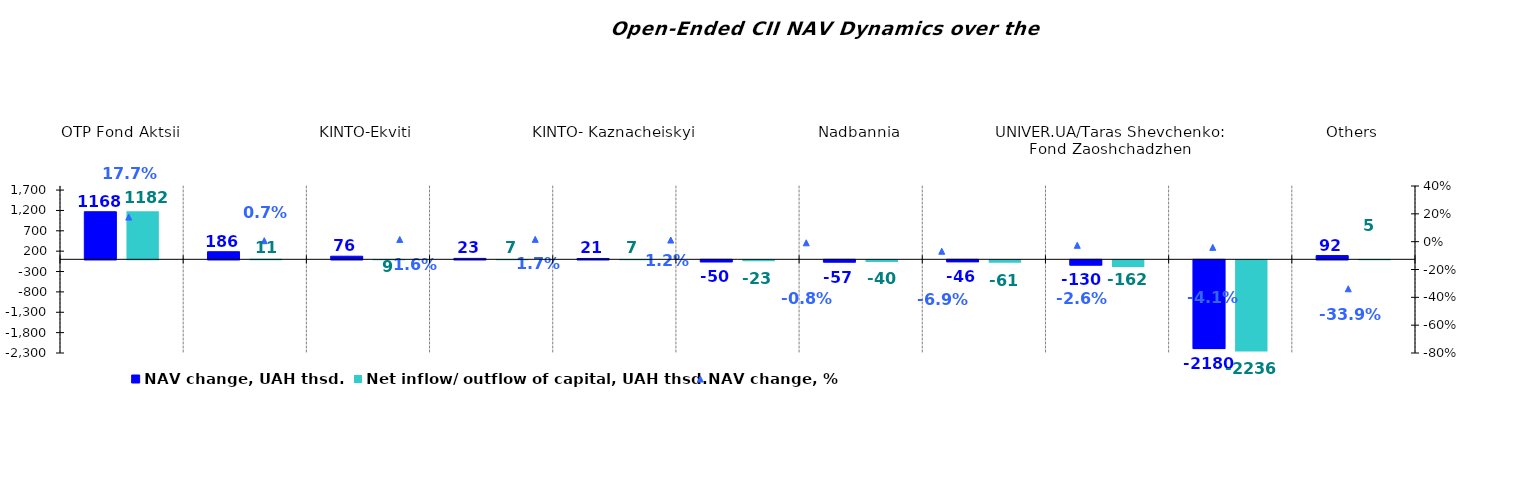
| Category | NAV change, UAH thsd. | Net inflow/ outflow of capital, UAH thsd. |
|---|---|---|
| ОТP Fond Aktsii | 1167.849 | 1181.762 |
| КІNTO- Klasychnyi | 186.382 | 11.431 |
| KINTO-Ekviti | 75.9 | 9.446 |
| UNIVER.UA/Volodymyr Velykyi: Fond Zbalansovanyi | 22.732 | 6.966 |
| KINTO- Kaznacheiskyi | 20.562 | 6.911 |
| Sofiivskyi | -49.794 | -22.997 |
| Nadbannia | -56.546 | -39.722 |
| VSI | -45.621 | -60.97 |
| UNIVER.UA/Taras Shevchenko: Fond Zaoshchadzhen | -129.848 | -161.544 |
| UNIVER.UA/Myhailo Hrushevskyi: Fond Derzhavnykh Paperiv    | -2180.06 | -2236.381 |
| Others | 91.589 | 5.417 |